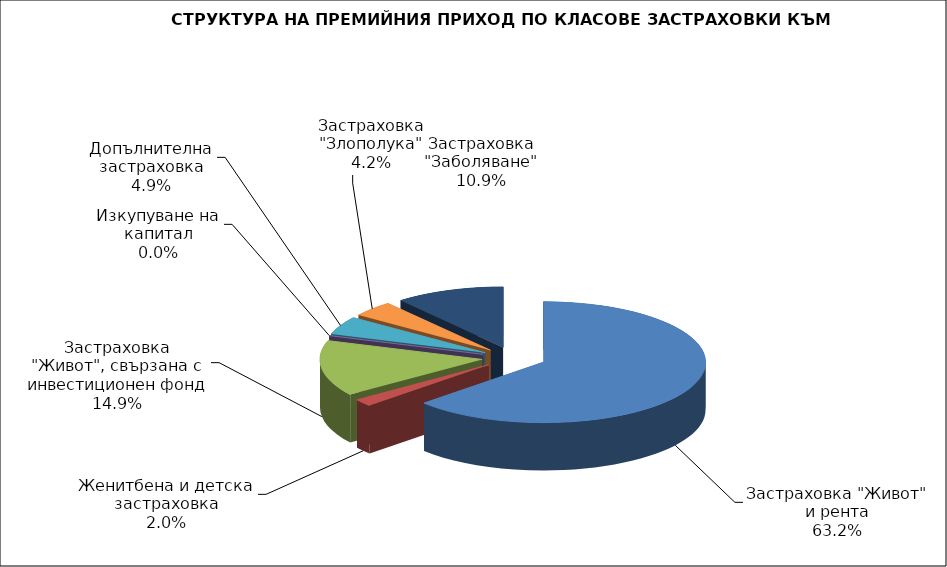
| Category | Series 0 |
|---|---|
| Застраховка "Живот" и рента | 193025733.593 |
| Женитбена и детска застраховка | 6004934.492 |
| Застраховка "Живот", свързана с инвестиционен фонд | 45553046.121 |
| Изкупуване на капитал | 0 |
| Допълнителна застраховка | 14822310.45 |
| Застраховка "Злополука" | 12927423.5 |
| Застраховка "Заболяване" | 33276516.98 |